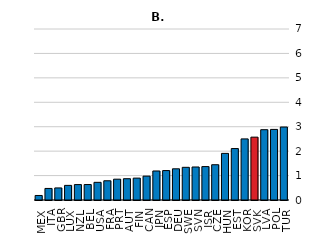
| Category | données triées |
|---|---|
| MEX | 0.185 |
| ITA | 0.473 |
| GBR | 0.494 |
| LUX | 0.598 |
| NZL | 0.631 |
| BEL | 0.633 |
| USA | 0.723 |
| FRA | 0.787 |
| PRT | 0.852 |
| AUT | 0.872 |
| FIN | 0.896 |
| CAN | 0.977 |
| JPN | 1.188 |
| ESP | 1.205 |
| DEU | 1.277 |
| SWE | 1.338 |
| SVN | 1.351 |
| ISR | 1.368 |
| CZE | 1.444 |
| HUN | 1.908 |
| EST | 2.106 |
| KOR | 2.501 |
| SVK | 2.573 |
| LVA | 2.878 |
| POL | 2.889 |
| TUR | 2.988 |